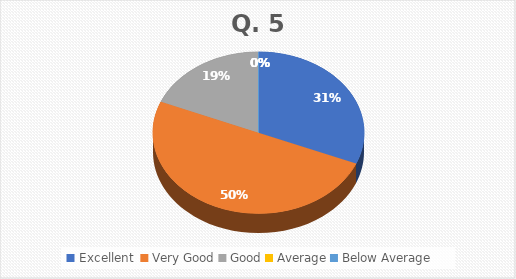
| Category | Series 0 |
|---|---|
| Excellent  | 5 |
| Very Good | 8 |
| Good | 3 |
| Average | 0 |
| Below Average | 0 |